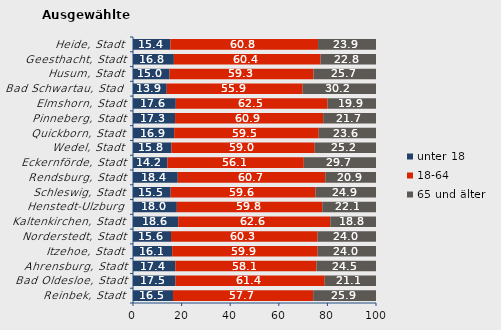
| Category | unter 18 | 18-64 | 65 und älter |
|---|---|---|---|
| Reinbek, Stadt | 16.456 | 57.691 | 25.853 |
| Bad Oldesloe, Stadt | 17.451 | 61.449 | 21.1 |
| Ahrensburg, Stadt | 17.441 | 58.102 | 24.456 |
| Itzehoe, Stadt | 16.12 | 59.88 | 24 |
| Norderstedt, Stadt | 15.642 | 60.336 | 24.023 |
| Kaltenkirchen, Stadt | 18.608 | 62.582 | 18.81 |
| Henstedt-Ulzburg | 18.048 | 59.843 | 22.109 |
| Schleswig, Stadt | 15.501 | 59.578 | 24.921 |
| Rendsburg, Stadt | 18.423 | 60.702 | 20.875 |
| Eckernförde, Stadt | 14.204 | 56.077 | 29.719 |
| Wedel, Stadt | 15.811 | 58.974 | 25.215 |
| Quickborn, Stadt | 16.933 | 59.499 | 23.568 |
| Pinneberg, Stadt | 17.311 | 60.95 | 21.74 |
| Elmshorn, Stadt | 17.609 | 62.462 | 19.929 |
| Bad Schwartau, Stadt | 13.89 | 55.934 | 30.176 |
| Husum, Stadt | 15.044 | 59.262 | 25.693 |
| Geesthacht, Stadt | 16.821 | 60.374 | 22.804 |
| Heide, Stadt | 15.394 | 60.754 | 23.852 |